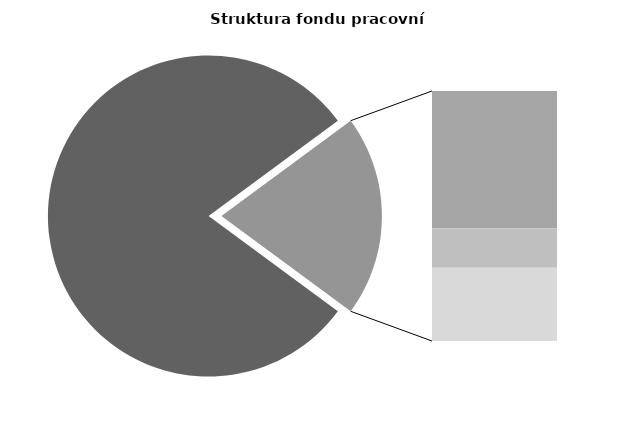
| Category | Series 0 |
|---|---|
| Průměrná měsíční odpracovaná doba bez přesčasu | 137.815 |
| Dovolená | 19.216 |
| Nemoc | 5.472 |
| Jiné | 10.243 |